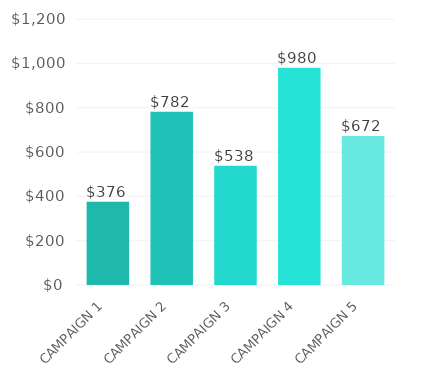
| Category | Series 0 |
|---|---|
| CAMPAIGN 1 | 375.571 |
| CAMPAIGN 2 | 781.5 |
| CAMPAIGN 3 | 538.439 |
| CAMPAIGN 4 | 980.051 |
| CAMPAIGN 5 | 671.871 |